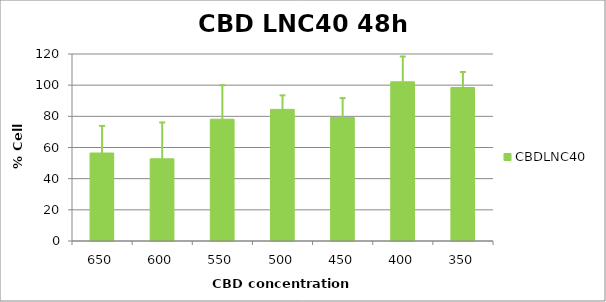
| Category | CBDLNC40 |
|---|---|
| 650.0 | 56.453 |
| 600.0 | 52.732 |
| 550.0 | 78.161 |
| 500.0 | 84.466 |
| 450.0 | 79.203 |
| 400.0 | 102.143 |
| 350.0 | 98.502 |